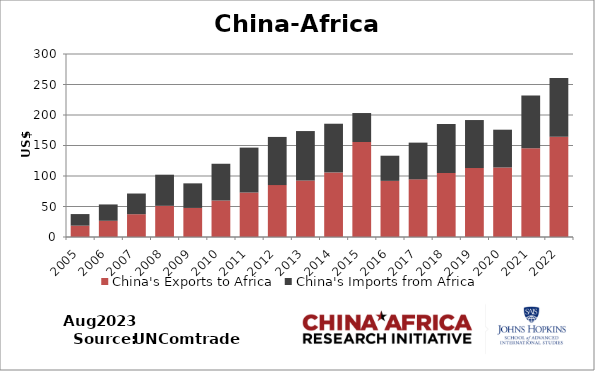
| Category | China's Exports to Africa | China's Imports from Africa |
|---|---|---|
| 2005.0 | 18.603 | 18.987 |
| 2006.0 | 26.584 | 26.794 |
| 2007.0 | 37.373 | 33.911 |
| 2008.0 | 51.089 | 51.042 |
| 2009.0 | 47.635 | 40.307 |
| 2010.0 | 59.807 | 60.266 |
| 2011.0 | 72.919 | 73.634 |
| 2012.0 | 85.134 | 78.911 |
| 2013.0 | 92.571 | 81.113 |
| 2014.0 | 105.833 | 79.859 |
| 2015.0 | 155.696 | 47.527 |
| 2016.0 | 91.985 | 41.273 |
| 2017.0 | 94.499 | 60.21 |
| 2018.0 | 104.949 | 80.337 |
| 2019.0 | 113.051 | 78.683 |
| 2020.0 | 113.96 | 61.949 |
| 2021.0 | 145.517 | 86.36 |
| 2022.0 | 164.16 | 96.661 |